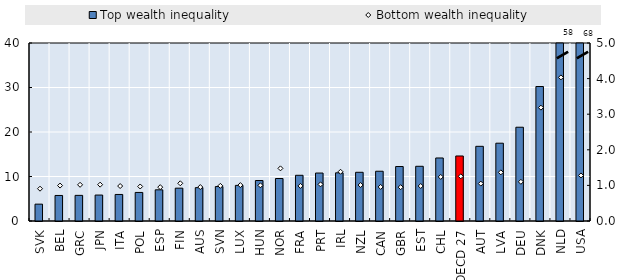
| Category | Top wealth inequality |
|---|---|
| SVK | 3.788 |
| BEL | 5.738 |
| GRC | 5.759 |
| JPN | 5.831 |
| ITA | 5.965 |
| POL | 6.418 |
| ESP | 7.006 |
| FIN | 7.381 |
| AUS | 7.494 |
| SVN | 7.742 |
| LUX | 8.007 |
| HUN | 9.096 |
| NOR | 9.547 |
| FRA | 10.272 |
| PRT | 10.778 |
| IRL | 10.827 |
| NZL | 10.947 |
| CAN | 11.181 |
| GBR | 12.242 |
| EST | 12.294 |
| CHL | 14.164 |
| OECD 27 | 14.611 |
| AUT | 16.782 |
| LVA | 17.484 |
| DEU | 21.071 |
| DNK | 30.224 |
| NLD | 58.22 |
| USA | 68.249 |